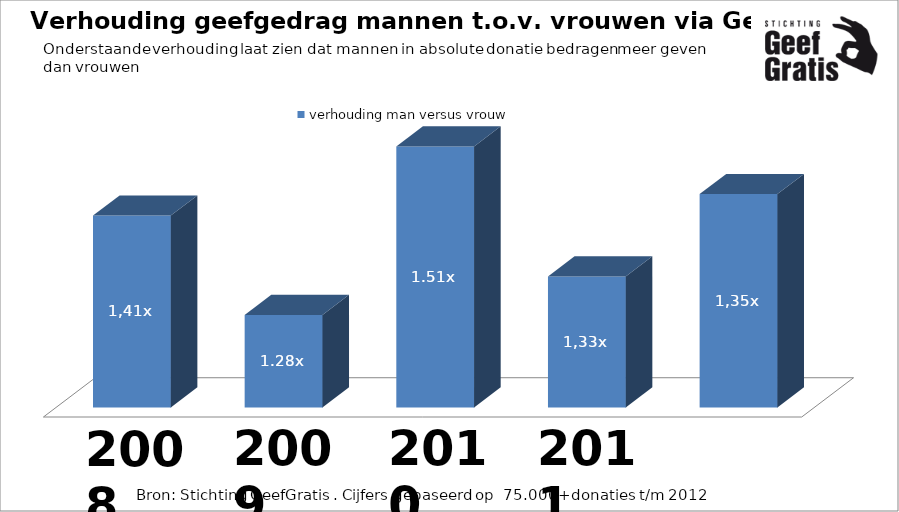
| Category | verhouding man versus vrouw |
|---|---|
| 1.605814668262916 | 1.415 |
| 1.5235784864166249 | 1.278 |
| 1.6017798352557848 | 1.51 |
| 1.4042231936623621 | 1.331 |